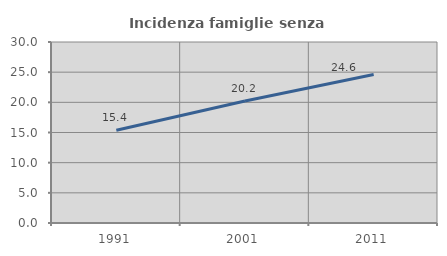
| Category | Incidenza famiglie senza nuclei |
|---|---|
| 1991.0 | 15.362 |
| 2001.0 | 20.21 |
| 2011.0 | 24.607 |